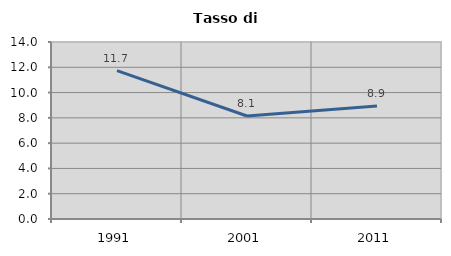
| Category | Tasso di disoccupazione   |
|---|---|
| 1991.0 | 11.738 |
| 2001.0 | 8.148 |
| 2011.0 | 8.936 |